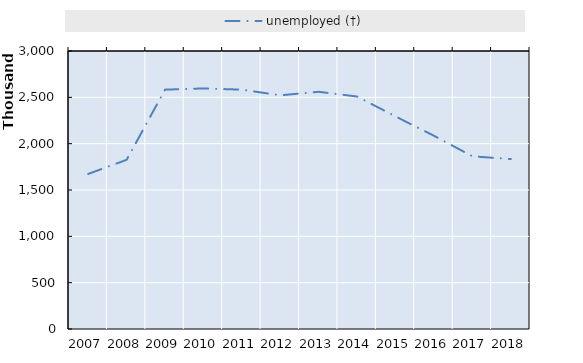
| Category | unemployed (†) |
|---|---|
| 2007.0 | 1673289.982 |
| 2008.0 | 1825689.99 |
| 2009.0 | 2583039.997 |
| 2010.0 | 2596169.992 |
| 2011.0 | 2582810.013 |
| 2012.0 | 2522029.986 |
| 2013.0 | 2559759.997 |
| 2014.0 | 2508629.989 |
| 2015.0 | 2293789.989 |
| 2016.0 | 2085210.001 |
| 2017.0 | 1863517.992 |
| 2018.0 | 1833699.988 |